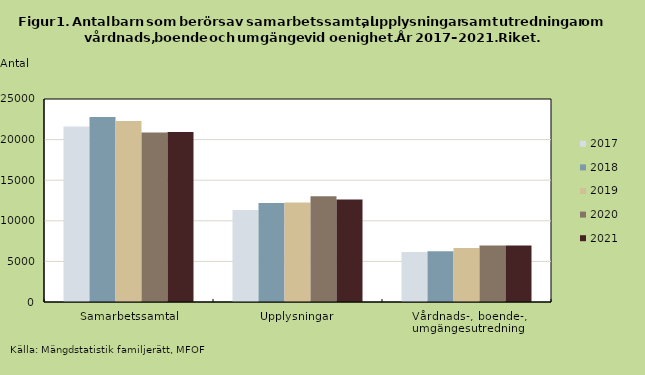
| Category | 2017 | 2018 | 2019 | 2020 | 2021 |
|---|---|---|---|---|---|
| Samarbetssamtal | 21622 | 22783 | 22290 | 20886 | 20931 |
| Upplysningar | 11323 | 12193 | 12258 | 13014 | 12612 |
| Vårdnads-, boende-, umgängesutredning | 6163 | 6243 | 6637 | 6969 | 6973 |